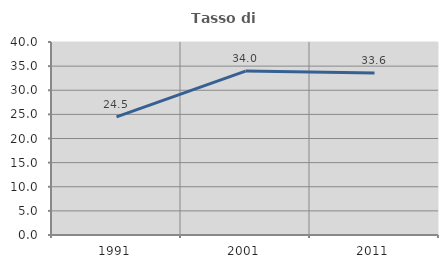
| Category | Tasso di occupazione   |
|---|---|
| 1991.0 | 24.49 |
| 2001.0 | 33.971 |
| 2011.0 | 33.588 |